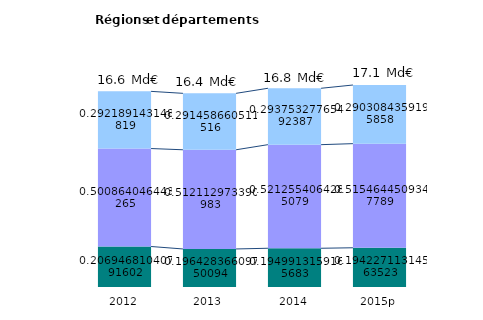
| Category | Personnel | Autre fonctionnement | Investissement |
|---|---|---|---|
| 2012 | 3.431 | 8.304 | 4.844 |
| 2013 | 3.224 | 8.405 | 4.784 |
| 2014 | 3.284 | 8.778 | 4.779 |
| 2015p | 3.325 | 8.824 | 4.97 |